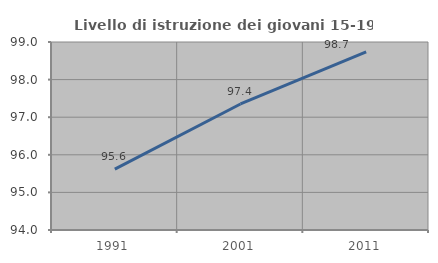
| Category | Livello di istruzione dei giovani 15-19 anni |
|---|---|
| 1991.0 | 95.62 |
| 2001.0 | 97.352 |
| 2011.0 | 98.738 |